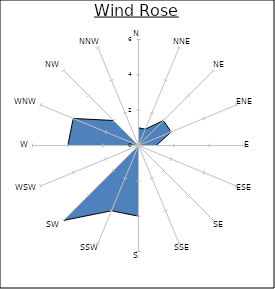
| Category | Series 0 |
|---|---|
| N | 1 |
| NNE | 1 |
| NE | 2 |
| ENE | 2 |
| E | 1 |
| ESE | 0 |
| SE | 0 |
| SSE | 0 |
| S | 4 |
| SSW | 4 |
| SW | 6 |
| WSW | 0 |
| W | 4 |
| WNW | 4 |
| NW | 2 |
| NNW | 0 |